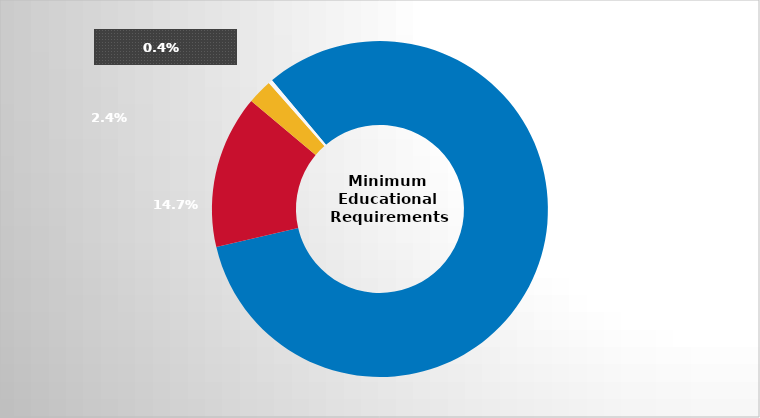
| Category | Series 0 |
|---|---|
| GED/High school diploma | 0.825 |
| Less than 1 year of college | 0.147 |
| 1 year of college | 0.024 |
| Other | 0.004 |